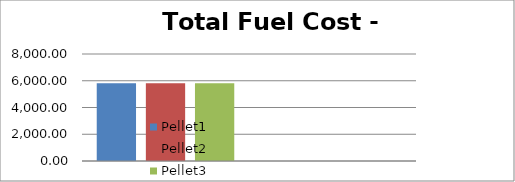
| Category | Pellet1 | Pellet2 | Pellet3 |
|---|---|---|---|
|  | 5811.932 | 5811.932 | 5811.932 |